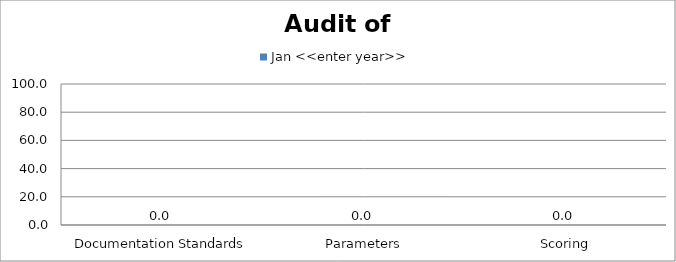
| Category | Jan <<enter year>> |
|---|---|
|  Documentation Standards | 0 |
|  Parameters | 0 |
|  Scoring | 0 |